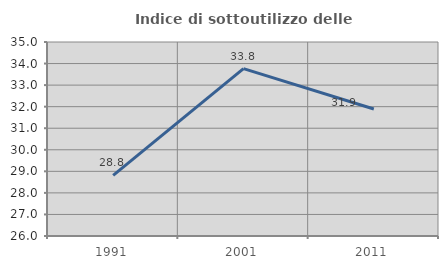
| Category | Indice di sottoutilizzo delle abitazioni  |
|---|---|
| 1991.0 | 28.81 |
| 2001.0 | 33.765 |
| 2011.0 | 31.89 |